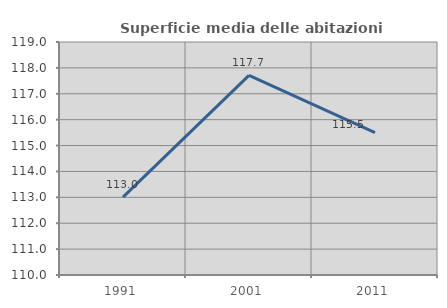
| Category | Superficie media delle abitazioni occupate |
|---|---|
| 1991.0 | 113.007 |
| 2001.0 | 117.712 |
| 2011.0 | 115.503 |